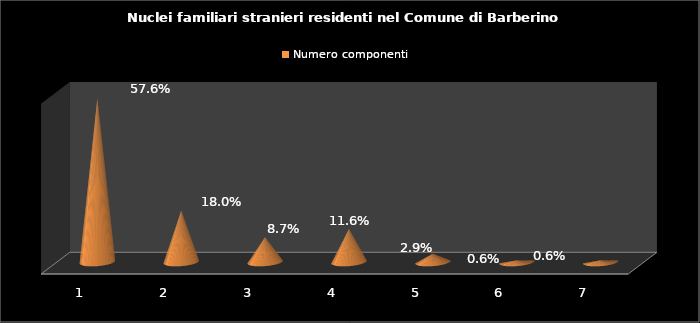
| Category | Numero componenti |
|---|---|
| 1.0 | 0.576 |
| 2.0 | 0.18 |
| 3.0 | 0.087 |
| 4.0 | 0.116 |
| 5.0 | 0.029 |
| 6.0 | 0.006 |
| 7.0 | 0.006 |